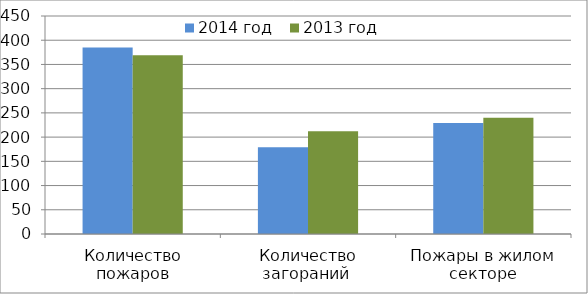
| Category | 2014 год | 2013 год |
|---|---|---|
| Количество пожаров | 385 | 369 |
| Количество загораний  | 179 | 212 |
| Пожары в жилом секторе | 229 | 240 |